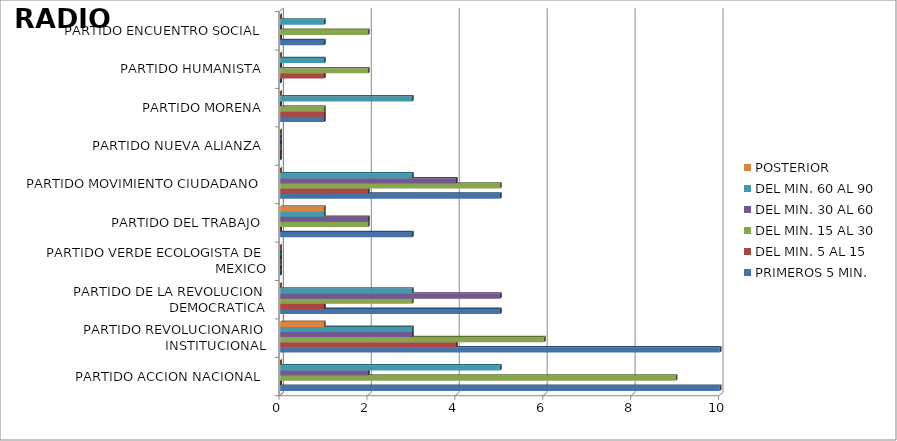
| Category | PRIMEROS 5 MIN. | DEL MIN. 5 AL 15 | DEL MIN. 15 AL 30 | DEL MIN. 30 AL 60 | DEL MIN. 60 AL 90 | POSTERIOR |
|---|---|---|---|---|---|---|
| PARTIDO ACCION NACIONAL | 10 | 0 | 9 | 2 | 5 | 0 |
| PARTIDO REVOLUCIONARIO INSTITUCIONAL | 10 | 4 | 6 | 3 | 3 | 1 |
| PARTIDO DE LA REVOLUCION DEMOCRATICA | 5 | 1 | 3 | 5 | 3 | 0 |
| PARTIDO VERDE ECOLOGISTA DE MEXICO | 0 | 0 | 0 | 0 | 0 | 0 |
| PARTIDO DEL TRABAJO | 3 | 0 | 2 | 2 | 1 | 1 |
| PARTIDO MOVIMIENTO CIUDADANO | 5 | 2 | 5 | 4 | 3 | 0 |
| PARTIDO NUEVA ALIANZA | 0 | 0 | 0 | 0 | 0 | 0 |
| PARTIDO MORENA | 1 | 1 | 1 | 0 | 3 | 0 |
| PARTIDO HUMANISTA | 0 | 1 | 2 | 0 | 1 | 0 |
| PARTIDO ENCUENTRO SOCIAL | 1 | 0 | 2 | 0 | 1 | 0 |